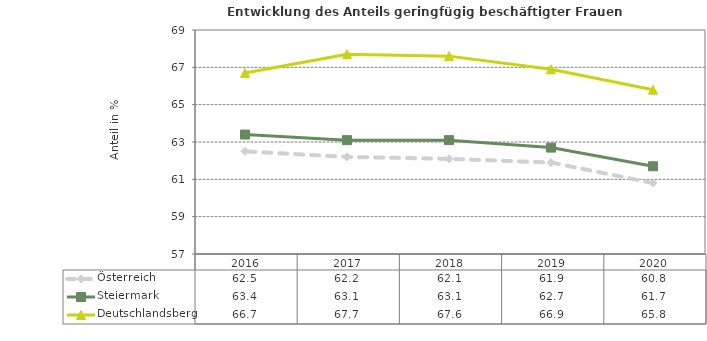
| Category | Österreich | Steiermark | Deutschlandsberg |
|---|---|---|---|
| 2020.0 | 60.8 | 61.7 | 65.8 |
| 2019.0 | 61.9 | 62.7 | 66.9 |
| 2018.0 | 62.1 | 63.1 | 67.6 |
| 2017.0 | 62.2 | 63.1 | 67.7 |
| 2016.0 | 62.5 | 63.4 | 66.7 |